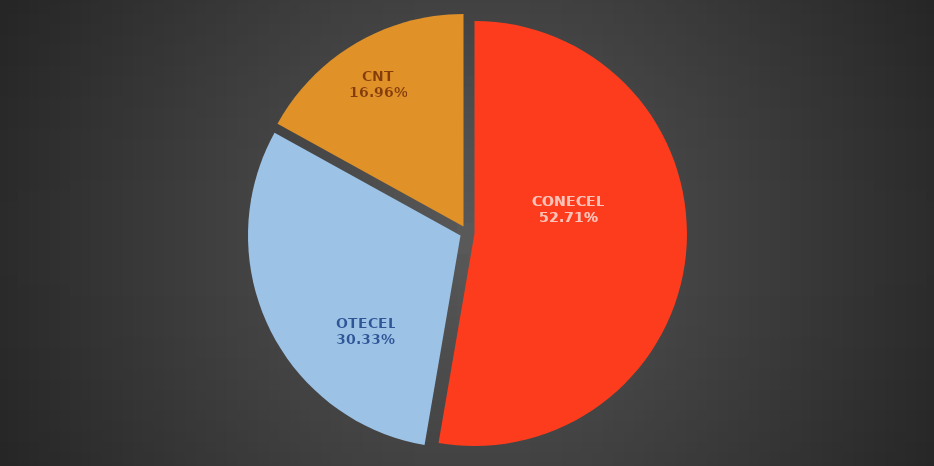
| Category | Jul 2018 |
|---|---|
| CONECEL | 8108264 |
| OTECEL | 4666163 |
| CNT | 2609567 |